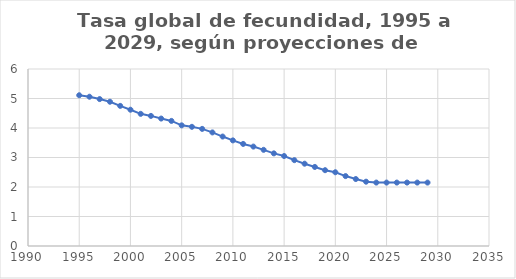
| Category | Hijos |
|---|---|
| 1995.0 | 5.11 |
| 1996.0 | 5.06 |
| 1997.0 | 4.98 |
| 1998.0 | 4.89 |
| 1999.0 | 4.75 |
| 2000.0 | 4.62 |
| 2001.0 | 4.48 |
| 2002.0 | 4.41 |
| 2003.0 | 4.32 |
| 2004.0 | 4.24 |
| 2005.0 | 4.09 |
| 2006.0 | 4.04 |
| 2007.0 | 3.97 |
| 2008.0 | 3.85 |
| 2009.0 | 3.71 |
| 2010.0 | 3.58 |
| 2011.0 | 3.46 |
| 2012.0 | 3.37 |
| 2013.0 | 3.26 |
| 2014.0 | 3.14 |
| 2015.0 | 3.05 |
| 2016.0 | 2.91 |
| 2017.0 | 2.79 |
| 2018.0 | 2.68 |
| 2019.0 | 2.57 |
| 2020.0 | 2.5 |
| 2021.0 | 2.37 |
| 2022.0 | 2.27 |
| 2023.0 | 2.18 |
| 2024.0 | 2.15 |
| 2025.0 | 2.15 |
| 2026.0 | 2.15 |
| 2027.0 | 2.15 |
| 2028.0 | 2.15 |
| 2029.0 | 2.15 |